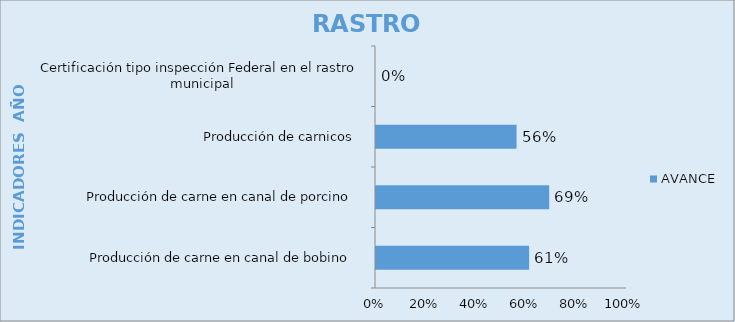
| Category | AVANCE |
|---|---|
| Producción de carne en canal de bobino  | 0.61 |
| Producción de carne en canal de porcino  | 0.69 |
| Producción de carnicos  | 0.56 |
| Certificación tipo inspección Federal en el rastro municipal | 0 |